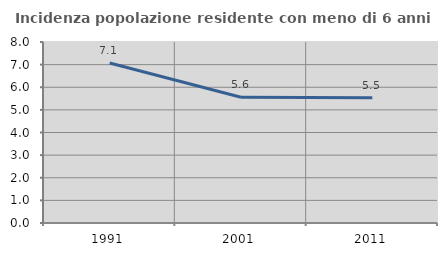
| Category | Incidenza popolazione residente con meno di 6 anni |
|---|---|
| 1991.0 | 7.075 |
| 2001.0 | 5.559 |
| 2011.0 | 5.533 |